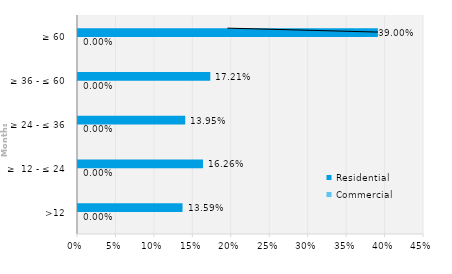
| Category | Commercial | Residential |
|---|---|---|
| >12 | 0 | 0.136 |
| ≥  12 - ≤ 24 | 0 | 0.163 |
| ≥ 24 - ≤ 36 | 0 | 0.139 |
| ≥ 36 - ≤ 60 | 0 | 0.172 |
| ≥ 60 | 0 | 0.39 |